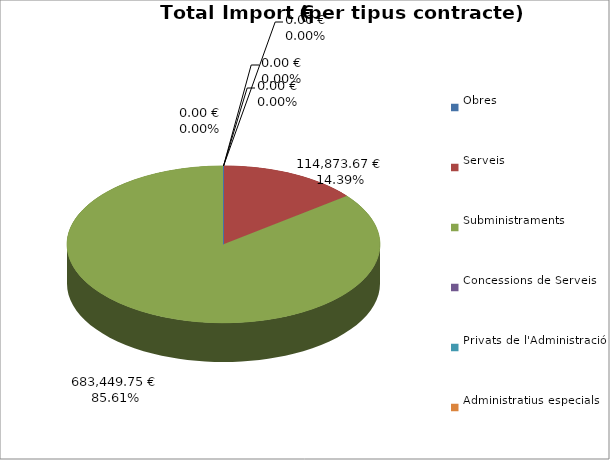
| Category | Total preu
(amb IVA) |
|---|---|
| Obres | 0 |
| Serveis | 114873.67 |
| Subministraments | 683449.75 |
| Concessions de Serveis | 0 |
| Privats de l'Administració | 0 |
| Administratius especials | 0 |